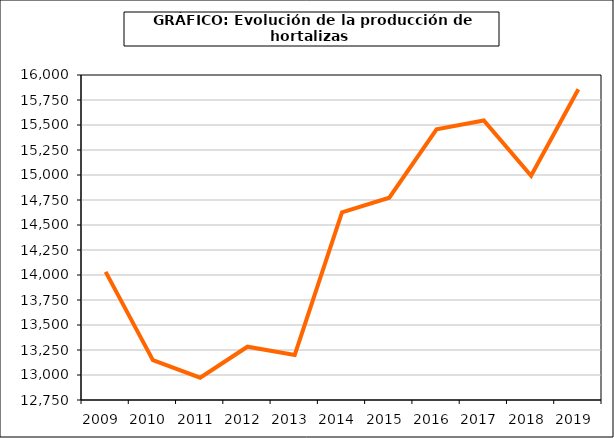
| Category | producción |
|---|---|
| 2009.0 | 14030.874 |
| 2010.0 | 13148.152 |
| 2011.0 | 12972.604 |
| 2012.0 | 13282.939 |
| 2013.0 | 13201.085 |
| 2014.0 | 14626.126 |
| 2015.0 | 14772.496 |
| 2016.0 | 15456.102 |
| 2017.0 | 15544.603 |
| 2018.0 | 14992.109 |
| 2019.0 | 15857.731 |